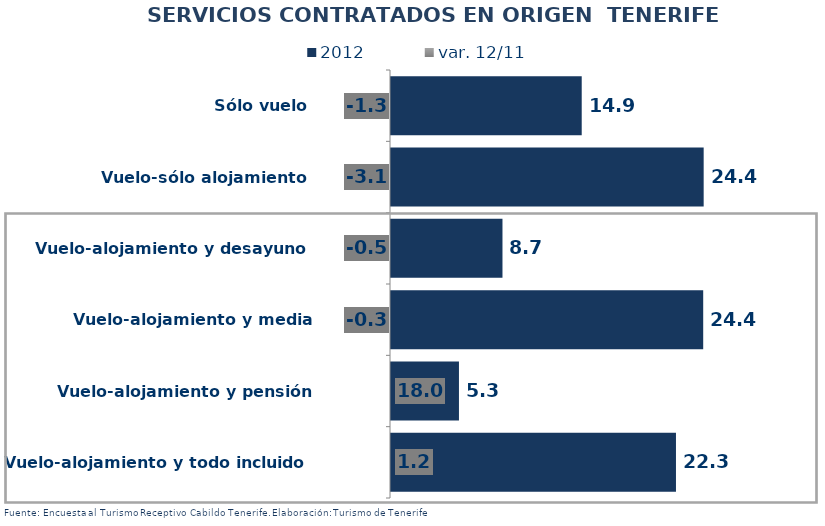
| Category | 2012 |
|---|---|
| Sólo vuelo | 14.9 |
| Vuelo-sólo alojamiento | 24.427 |
| Vuelo-alojamiento y desayuno | 8.709 |
| Vuelo-alojamiento y media pensión | 24.391 |
| Vuelo-alojamiento y pensión completa | 5.309 |
| Vuelo-alojamiento y todo incluido | 22.264 |